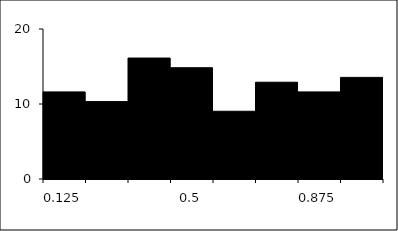
| Category | Series 1 |
|---|---|
| 0.125 | 11.613 |
| 0.25 | 10.323 |
| 0.375 | 16.129 |
| 0.5 | 14.839 |
| 0.625 | 9.032 |
| 0.75 | 12.903 |
| 0.875 | 11.613 |
| 1.0 | 13.548 |